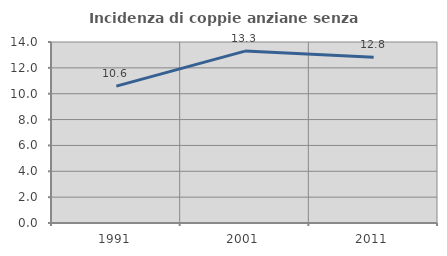
| Category | Incidenza di coppie anziane senza figli  |
|---|---|
| 1991.0 | 10.588 |
| 2001.0 | 13.298 |
| 2011.0 | 12.821 |